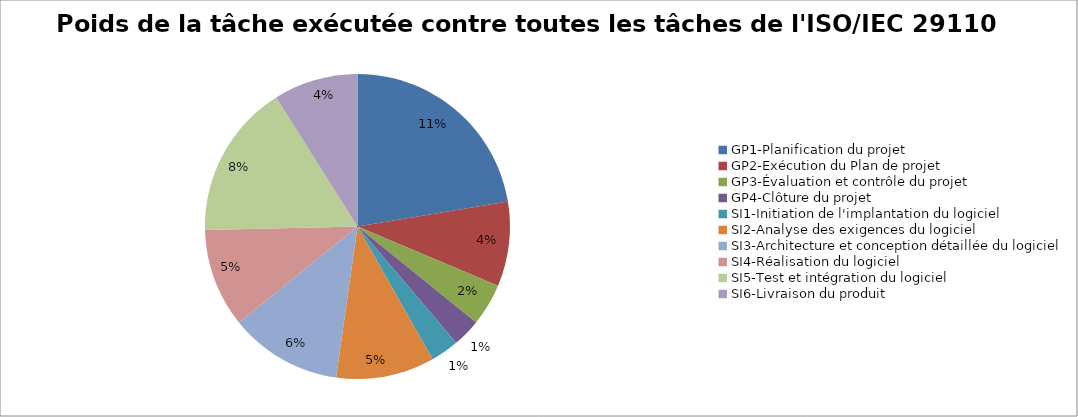
| Category | % Point vers les 67 tâches |
|---|---|
| GP1-Planification du projet | 0.112 |
| GP2-Exécution du Plan de projet | 0.045 |
| GP3-Évaluation et contrôle du projet | 0.022 |
| GP4-Clôture du projet | 0.015 |
| SI1-Initiation de l'implantation du logiciel | 0.015 |
| SI2-Analyse des exigences du logiciel | 0.052 |
| SI3-Architecture et conception détaillée du logiciel | 0.06 |
| SI4-Réalisation du logiciel | 0.052 |
| SI5-Test et intégration du logiciel | 0.082 |
| SI6-Livraison du produit | 0.045 |